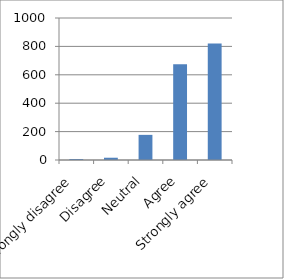
| Category | Series 0 |
|---|---|
| Strongly disagree | 7 |
| Disagree | 16 |
| Neutral | 177 |
| Agree | 674 |
| Strongly agree | 820 |